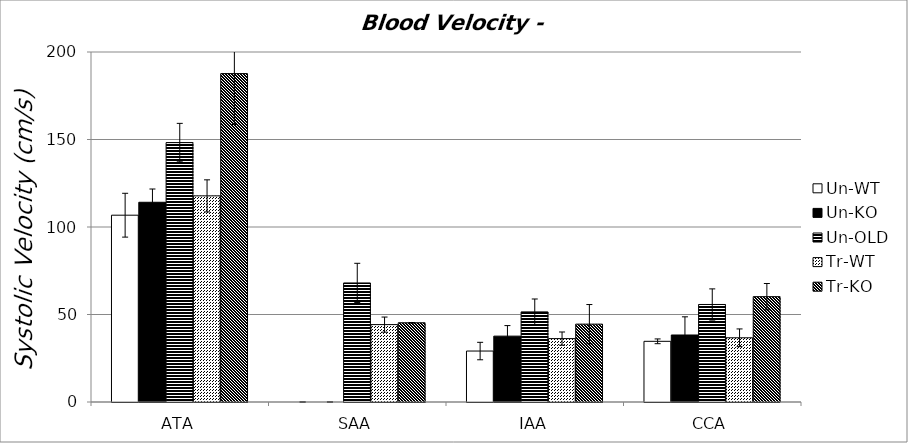
| Category | Un-WT | Un-KO | Un-OLD | Tr-WT | Tr-KO |
|---|---|---|---|---|---|
| 0 | 106.743 | 114.126 | 148.23 | 117.786 | 187.656 |
| 1 | 0 | 0 | 68.035 | 44.227 | 45.266 |
| 2 | 29.117 | 37.637 | 51.5 | 36.223 | 44.492 |
| 3 | 34.678 | 38.288 | 55.723 | 36.698 | 60.2 |